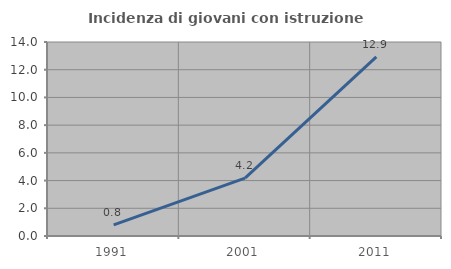
| Category | Incidenza di giovani con istruzione universitaria |
|---|---|
| 1991.0 | 0.797 |
| 2001.0 | 4.183 |
| 2011.0 | 12.928 |